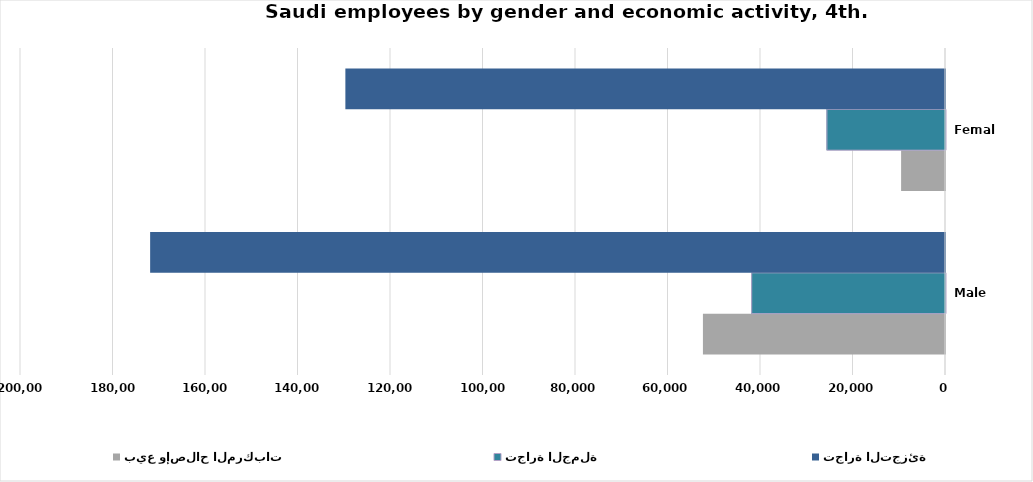
| Category | بيع وإصلاح المركبات  | تجارة الجملة | تجارة التجزئة |
|---|---|---|---|
| Male | 52339 | 41906 | 171862 |
| Female | 9492 | 25640 | 129650 |